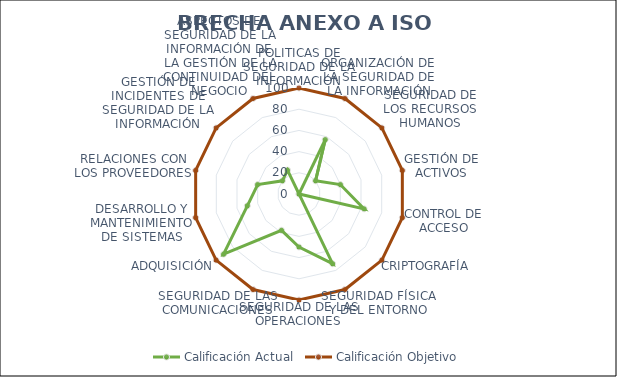
| Category | Calificación Actual | Calificación Objetivo |
|---|---|---|
| 0 | 0 | 100 |
| 1 | 57 | 100 |
| 2 | 20 | 100 |
| 3 | 40 | 100 |
| 4 | 63 | 100 |
| 5 | 0 | 100 |
| 6 | 73 | 100 |
| 7 | 50 | 100 |
| 8 | 38 | 100 |
| 9 | 91 | 100 |
| 10 | 50 | 100 |
| 11 | 40 | 100 |
| 12 | 20 | 100 |
| 13 | 25 | 100 |